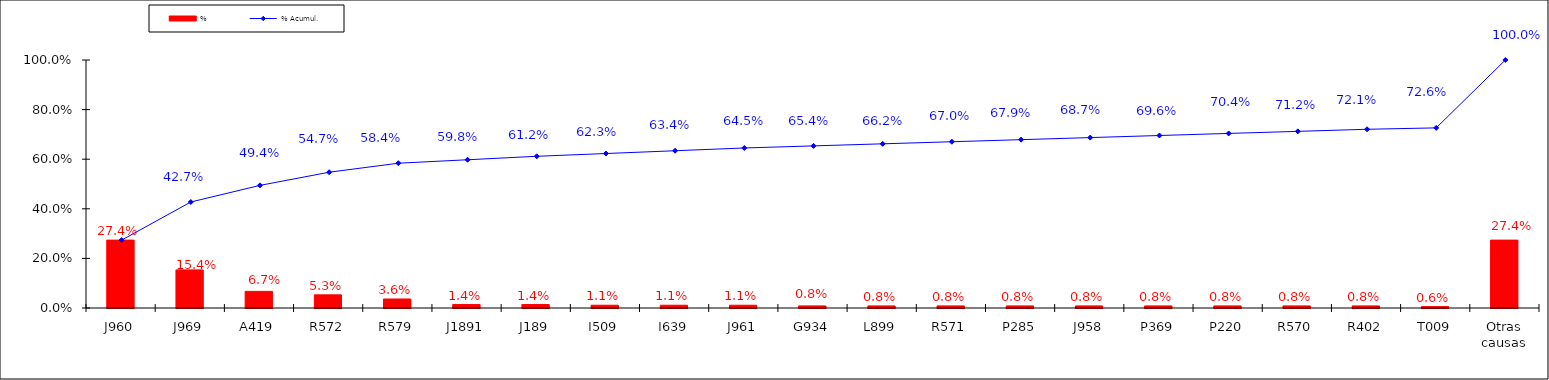
| Category | % |
|---|---|
| J960 | 0.274 |
| J969 | 0.154 |
| A419 | 0.067 |
| R572 | 0.053 |
| R579 | 0.036 |
| J1891 | 0.014 |
| J189 | 0.014 |
| I509 | 0.011 |
| I639 | 0.011 |
| J961 | 0.011 |
| G934 | 0.008 |
| L899 | 0.008 |
| R571 | 0.008 |
| P285 | 0.008 |
| J958 | 0.008 |
| P369 | 0.008 |
| P220 | 0.008 |
| R570 | 0.008 |
| R402 | 0.008 |
| T009 | 0.006 |
| Otras causas | 0.274 |